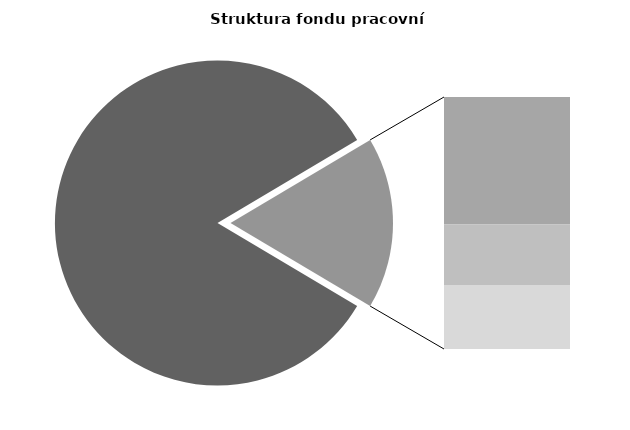
| Category | Series 0 |
|---|---|
| Průměrná měsíční odpracovaná doba bez přesčasu | 141.623 |
| Dovolená | 14.758 |
| Nemoc | 7.001 |
| Jiné | 7.42 |